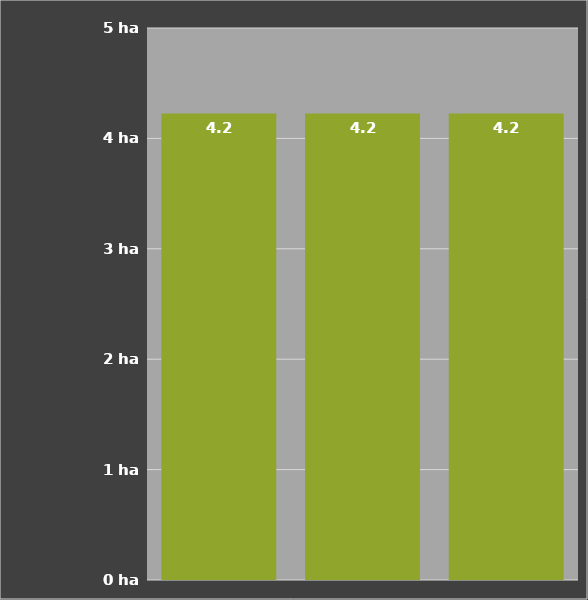
| Category | Flächenleistung
je Std. ("netto") |
|---|---|
| 0 | 4.225 |
| 1 | 4.225 |
| 2 | 4.225 |